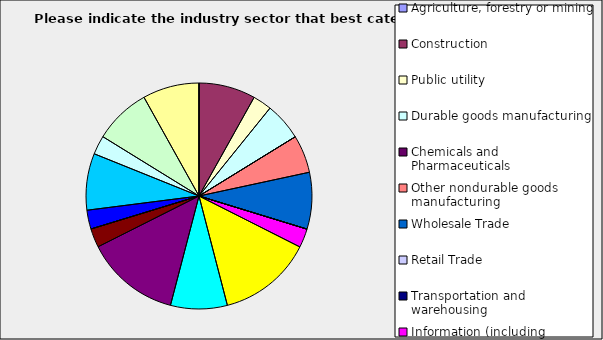
| Category | Series 0 |
|---|---|
| Agriculture, forestry or mining | 0 |
| Construction | 0.081 |
| Public utility | 0.027 |
| Durable goods manufacturing | 0.054 |
| Chemicals and Pharmaceuticals | 0 |
| Other nondurable goods manufacturing | 0.054 |
| Wholesale Trade | 0.081 |
| Retail Trade | 0 |
| Transportation and warehousing | 0 |
| Information (including broadcasting and telecommunication) | 0.027 |
| Finance and Insurance | 0.135 |
| Real Estate | 0.081 |
| Professional, scientific and technical services | 0.135 |
| Consulting | 0.027 |
| Administrative and office services (including waste management) | 0 |
| Education | 0.027 |
| Health Care and social services | 0.081 |
| Arts, entertainment and recreation | 0.027 |
| Accommodation and food services | 0.081 |
| Other | 0.081 |